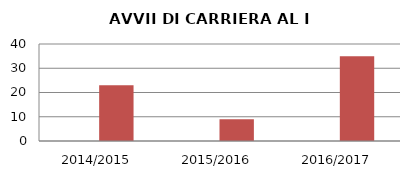
| Category | ANNO | NUMERO |
|---|---|---|
| 2014/2015 | 0 | 23 |
| 2015/2016 | 0 | 9 |
| 2016/2017 | 0 | 35 |